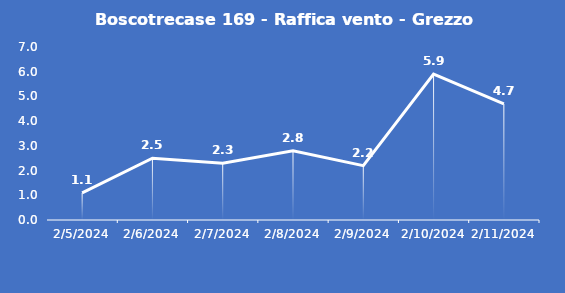
| Category | Boscotrecase 169 - Raffica vento - Grezzo (m/s) |
|---|---|
| 2/5/24 | 1.1 |
| 2/6/24 | 2.5 |
| 2/7/24 | 2.3 |
| 2/8/24 | 2.8 |
| 2/9/24 | 2.2 |
| 2/10/24 | 5.9 |
| 2/11/24 | 4.7 |